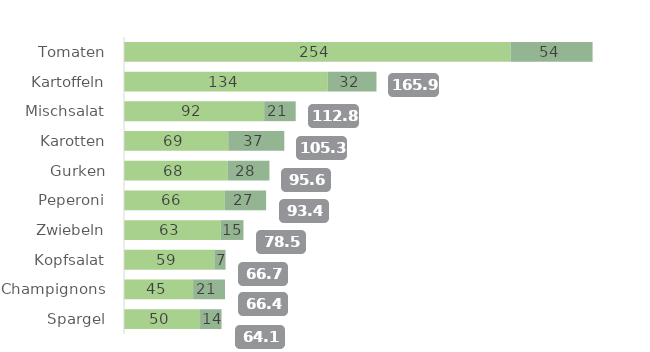
| Category | nicht Bio | Bio |
|---|---|---|
| Tomaten | 254.079 | 53.825 |
| Kartoffeln | 133.807 | 32.092 |
| Mischsalat | 92.085 | 20.733 |
| Karotten | 68.507 | 36.816 |
| Gurken | 67.995 | 27.566 |
| Peperoni | 66.296 | 27.081 |
| Zwiebeln | 63.372 | 15.134 |
| Kopfsalat | 59.333 | 7.371 |
| Champignons | 45.402 | 20.999 |
| Spargel | 49.981 | 14.111 |